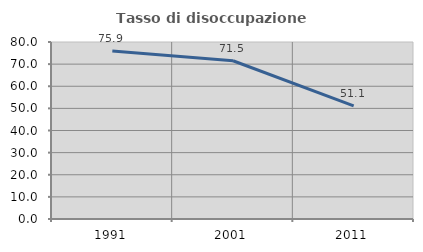
| Category | Tasso di disoccupazione giovanile  |
|---|---|
| 1991.0 | 75.899 |
| 2001.0 | 71.533 |
| 2011.0 | 51.111 |